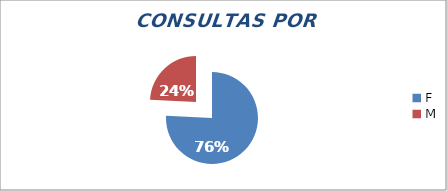
| Category | Series 0 |
|---|---|
| F | 1423 |
| M | 455 |